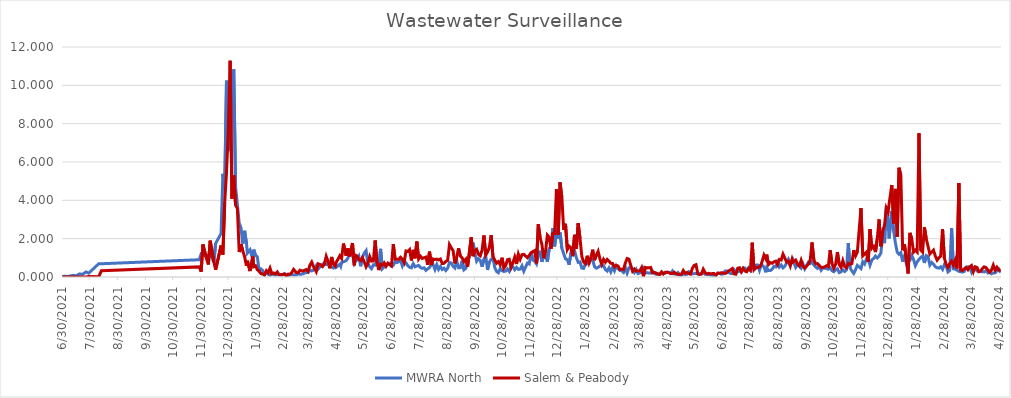
| Category | MWRA North | Salem & Peabody |
|---|---|---|
| 6/30/21 | 0.023 | 0 |
| 7/2/21 | 0.04 | 0 |
| 7/6/21 | 0.027 | 0 |
| 7/8/21 | 0.05 | 0 |
| 7/12/21 | 0.087 | 0 |
| 7/15/21 | 0.059 | 0 |
| 7/19/21 | 0.163 | 0 |
| 7/22/21 | 0.136 | 0 |
| 7/26/21 | 0.263 | 0 |
| 7/29/21 | 0.2 | 0.032 |
| 8/9/21 | 0.691 | 0.007 |
| 8/12/21 | 0.691 | 0.329 |
| 11/28/21 | 0.901 | 0.528 |
| 11/30/21 | 1.204 | 0.275 |
| 12/2/21 | 1.163 | 1.699 |
| 12/6/21 | 1.093 | 0.943 |
| 12/8/21 | 1.152 | 0.651 |
| 12/10/21 | 1.257 | 1.895 |
| 12/14/21 | 0.765 | 0.806 |
| 12/16/21 | 1.751 | 0.377 |
| 12/22/21 | 2.277 | 1.638 |
| 12/24/21 | 5.383 | 1.167 |
| 12/26/21 | 4.572 | 3.882 |
| 12/28/21 | 10.243 | 5.443 |
| 12/30/21 | 8.435 | 7.638 |
| 1/1/22 | 6.568 | 11.282 |
| 1/3/22 | 10.196 | 4.086 |
| 1/5/22 | 10.833 | 5.297 |
| 1/7/22 | 4.705 | 3.753 |
| 1/9/22 | 3.807 | 3.57 |
| 1/11/22 | 2.813 | 1.302 |
| 1/13/22 | 2.562 | 1.704 |
| 1/15/22 | 1.737 | 1.36 |
| 1/17/22 | 2.411 | 1.052 |
| 1/19/22 | 1.766 | 0.581 |
| 1/20/22 | 1.245 | 0.849 |
| 1/23/22 | 1.42 | 0.312 |
| 1/26/22 | 0.904 | 1.062 |
| 1/27/22 | 1.426 | 0.538 |
| 1/29/22 | 1.132 | 0.587 |
| 1/31/22 | 1.053 | 0.378 |
| 2/2/22 | 0.334 | 0.319 |
| 2/4/22 | 0.422 | 0.179 |
| 2/6/22 | 0.336 | 0.151 |
| 2/8/22 | 0.11 | 0.116 |
| 2/10/22 | 0.233 | 0.327 |
| 2/12/22 | 0.14 | 0.223 |
| 2/14/22 | 0.094 | 0.461 |
| 2/16/22 | 0.206 | 0.164 |
| 2/18/22 | 0.124 | 0.209 |
| 2/20/22 | 0.101 | 0.169 |
| 2/22/22 | 0.124 | 0.267 |
| 2/24/22 | 0.138 | 0.116 |
| 2/26/22 | 0.113 | 0.121 |
| 2/28/22 | 0.102 | 0.138 |
| 3/2/22 | 0.17 | 0.16 |
| 3/4/22 | 0.121 | 0.039 |
| 3/6/22 | 0.08 | 0.151 |
| 3/8/22 | 0.105 | 0.146 |
| 3/10/22 | 0.139 | 0.227 |
| 3/12/22 | 0.105 | 0.397 |
| 3/15/22 | 0.115 | 0.231 |
| 3/17/22 | 0.165 | 0.219 |
| 3/19/22 | 0.138 | 0.356 |
| 3/22/22 | 0.161 | 0.308 |
| 3/26/22 | 0.236 | 0.388 |
| 3/28/22 | 0.23 | 0.293 |
| 3/30/22 | 0.371 | 0.617 |
| 4/1/22 | 0.316 | 0.779 |
| 4/3/22 | 0.358 | 0.54 |
| 4/6/22 | 0.589 | 0.279 |
| 4/8/22 | 0.411 | 0.688 |
| 4/11/22 | 0.565 | 0.635 |
| 4/13/22 | 0.647 | 0.546 |
| 4/15/22 | 0.752 | 0.666 |
| 4/17/22 | 0.654 | 1.077 |
| 4/19/22 | 0.641 | 0.82 |
| 4/21/22 | 0.571 | 0.454 |
| 4/23/22 | 0.524 | 1.046 |
| 4/25/22 | 0.471 | 0.662 |
| 4/27/22 | 0.623 | 0.575 |
| 4/28/22 | 0.505 | 0.756 |
| 5/2/22 | 0.662 | 1.104 |
| 5/3/22 | 0.561 | 1.022 |
| 5/4/22 | 0.751 | 0.963 |
| 5/6/22 | 0.789 | 1.744 |
| 5/9/22 | 0.853 | 1.115 |
| 5/11/22 | 0.995 | 1.498 |
| 5/13/22 | 1.285 | 1.074 |
| 5/16/22 | 1.143 | 1.773 |
| 5/18/22 | 0.696 | 0.611 |
| 5/19/22 | 0.784 | 1.144 |
| 5/21/22 | 0.906 | 1.1 |
| 5/23/22 | 1.077 | 0.91 |
| 5/25/22 | 0.561 | 0.853 |
| 5/27/22 | 1.043 | 1.006 |
| 5/29/22 | 1.246 | 0.785 |
| 5/31/22 | 1.375 | 0.53 |
| 6/2/22 | 0.696 | 0.713 |
| 6/4/22 | 0.532 | 1.066 |
| 6/6/22 | 0.435 | 0.828 |
| 6/8/22 | 0.636 | 0.839 |
| 6/10/22 | 0.619 | 1.907 |
| 6/12/22 | 0.932 | 0.783 |
| 6/14/22 | 0.461 | 0.361 |
| 6/16/22 | 1.468 | 0.667 |
| 6/18/22 | 0.433 | 0.622 |
| 6/20/22 | 0.532 | 0.737 |
| 6/22/22 | 0.611 | 0.559 |
| 6/24/22 | 0.648 | 0.724 |
| 6/26/22 | 0.688 | 0.646 |
| 6/28/22 | 0.562 | 0.577 |
| 6/30/22 | 0.607 | 1.712 |
| 7/2/22 | 0.8 | 0.932 |
| 7/4/22 | 0.751 | 0.927 |
| 7/6/22 | 0.8 | 0.928 |
| 7/8/22 | 0.861 | 1.027 |
| 7/10/22 | 0.579 | 0.928 |
| 7/12/22 | 0.808 | 0.757 |
| 7/14/22 | 0.742 | 1.358 |
| 7/16/22 | 0.592 | 1.335 |
| 7/18/22 | 0.509 | 1.432 |
| 7/20/22 | 0.482 | 0.863 |
| 7/22/22 | 0.695 | 1.416 |
| 7/24/22 | 0.53 | 0.974 |
| 7/26/22 | 0.576 | 1.848 |
| 7/28/22 | 0.605 | 0.943 |
| 7/30/22 | 0.492 | 1.081 |
| 8/1/22 | 0.453 | 0.969 |
| 8/3/22 | 0.481 | 1.003 |
| 8/5/22 | 0.349 | 1.038 |
| 8/7/22 | 0.424 | 0.634 |
| 8/9/22 | 0.492 | 1.322 |
| 8/11/22 | 0.664 | 0.624 |
| 8/13/22 | 0.648 | 0.94 |
| 8/15/22 | 0.393 | 0.912 |
| 8/17/22 | 0.648 | 0.935 |
| 8/19/22 | 0.397 | 0.892 |
| 8/21/22 | 0.546 | 0.94 |
| 8/23/22 | 0.392 | 0.701 |
| 8/25/22 | 0.461 | 0.713 |
| 8/27/22 | 0.339 | 0.812 |
| 8/29/22 | 0.46 | 0.873 |
| 8/31/22 | 0.758 | 1.69 |
| 9/2/22 | 0.728 | 1.519 |
| 9/4/22 | 0.557 | 1.377 |
| 9/6/22 | 0.473 | 0.706 |
| 9/8/22 | 0.826 | 1.041 |
| 9/10/22 | 0.485 | 1.497 |
| 9/12/22 | 0.489 | 1.095 |
| 9/14/22 | 0.851 | 0.994 |
| 9/16/22 | 0.375 | 0.804 |
| 9/18/22 | 0.45 | 0.926 |
| 9/20/22 | 0.767 | 0.537 |
| 9/24/22 | 1.357 | 2.067 |
| 9/26/22 | 1.79 | 1.083 |
| 9/28/22 | 1.272 | 1.382 |
| 9/30/22 | 0.825 | 1.447 |
| 10/2/22 | 0.959 | 1.18 |
| 10/4/22 | 0.862 | 1.109 |
| 10/6/22 | 0.536 | 1.407 |
| 10/8/22 | 0.925 | 2.166 |
| 10/10/22 | 1.104 | 1.147 |
| 10/12/22 | 0.369 | 1.304 |
| 10/14/22 | 0.781 | 1.544 |
| 10/16/22 | 0.928 | 2.189 |
| 10/18/22 | 0.972 | 1.054 |
| 10/20/22 | 0.493 | 0.883 |
| 10/22/22 | 0.287 | 0.721 |
| 10/24/22 | 0.224 | 0.803 |
| 10/26/22 | 0.45 | 0.639 |
| 10/28/22 | 0.325 | 1.007 |
| 10/30/22 | 0.287 | 0.464 |
| 11/1/22 | 0.307 | 0.6 |
| 11/3/22 | 0.421 | 0.904 |
| 11/5/22 | 0.293 | 0.926 |
| 11/7/22 | 0.54 | 0.505 |
| 11/9/22 | 0.525 | 0.742 |
| 11/11/22 | 0.38 | 1.039 |
| 11/13/22 | 0.5 | 0.678 |
| 11/15/22 | 0.397 | 1.19 |
| 11/17/22 | 0.414 | 0.927 |
| 11/19/22 | 0.583 | 1.166 |
| 11/21/22 | 0.304 | 1.181 |
| 11/25/22 | 0.727 | 1.009 |
| 11/27/22 | 0.682 | 1.128 |
| 11/29/22 | 1.292 | 1.263 |
| 12/1/22 | 0.879 | 1.332 |
| 12/3/22 | 0.834 | 1.378 |
| 12/5/22 | 0.685 | 0.71 |
| 12/7/22 | 1.094 | 2.747 |
| 12/9/22 | 1.37 | 2.05 |
| 12/11/22 | 0.792 | 1.692 |
| 12/13/22 | 1.108 | 0.983 |
| 12/15/22 | 1.123 | 1.348 |
| 12/17/22 | 0.789 | 2.185 |
| 12/19/22 | 1.476 | 2.073 |
| 12/21/22 | 1.593 | 1.47 |
| 12/23/22 | 2.551 | 2.278 |
| 12/25/22 | 1.597 | 2.275 |
| 12/27/22 | 2.423 | 4.578 |
| 12/29/22 | 2.003 | 2.196 |
| 12/31/22 | 2.33 | 4.939 |
| 1/2/23 | 1.499 | 4.153 |
| 1/4/23 | 1.214 | 2.457 |
| 1/6/23 | 0.947 | 2.778 |
| 1/8/23 | 0.904 | 1.437 |
| 1/10/23 | 0.64 | 1.61 |
| 1/12/23 | 1.241 | 1.532 |
| 1/14/23 | 1.154 | 1.092 |
| 1/16/23 | 1.37 | 2.202 |
| 1/18/23 | 1.009 | 1.465 |
| 1/20/23 | 0.763 | 2.809 |
| 1/22/23 | 0.787 | 2.022 |
| 1/24/23 | 0.465 | 1.08 |
| 1/26/23 | 0.448 | 0.782 |
| 1/28/23 | 0.685 | 0.698 |
| 1/30/23 | 0.689 | 1.11 |
| 2/1/23 | 0.706 | 0.743 |
| 2/3/23 | 0.907 | 1.008 |
| 2/5/23 | 0.913 | 1.425 |
| 2/7/23 | 0.539 | 0.879 |
| 2/9/23 | 0.461 | 1.141 |
| 2/11/23 | 0.498 | 1.339 |
| 2/13/23 | 0.579 | 0.95 |
| 2/15/23 | 0.588 | 0.66 |
| 2/17/23 | 0.592 | 0.919 |
| 2/19/23 | 0.391 | 0.773 |
| 2/21/23 | 0.312 | 0.917 |
| 2/23/23 | 0.472 | 0.828 |
| 2/25/23 | 0.266 | 0.714 |
| 2/27/23 | 0.513 | 0.704 |
| 3/1/23 | 0.321 | 0.528 |
| 3/3/23 | 0.58 | 0.61 |
| 3/5/23 | 0.437 | 0.573 |
| 3/7/23 | 0.341 | 0.388 |
| 3/9/23 | 0.33 | 0.412 |
| 3/11/23 | 0.24 | 0.383 |
| 3/13/23 | 0.499 | 0.725 |
| 3/15/23 | 0.197 | 0.964 |
| 3/17/23 | 0.479 | 0.931 |
| 3/19/23 | 0.51 | 0.612 |
| 3/21/23 | 0.399 | 0.301 |
| 3/23/23 | 0.237 | 0.415 |
| 3/25/23 | 0.395 | 0.308 |
| 3/27/23 | 0.178 | 0.314 |
| 3/29/23 | 0.217 | 0.326 |
| 3/31/23 | 0.243 | 0.491 |
| 4/2/23 | 0.43 | 0.024 |
| 4/4/23 | 0.215 | 0.5 |
| 4/6/23 | 0.229 | 0.475 |
| 4/8/23 | 0.202 | 0.481 |
| 4/10/23 | 0.209 | 0.497 |
| 4/12/23 | 0.305 | 0.215 |
| 4/14/23 | 0.182 | 0.243 |
| 4/16/23 | 0.142 | 0.21 |
| 4/18/23 | 0.177 | 0.143 |
| 4/20/23 | 0.158 | 0.13 |
| 4/22/23 | 0.195 | 0.266 |
| 4/24/23 | 0.209 | 0.158 |
| 4/26/23 | 0.195 | 0.249 |
| 4/28/23 | 0.245 | 0.25 |
| 4/30/23 | 0.245 | 0.228 |
| 5/2/23 | 0.18 | 0.185 |
| 5/4/23 | 0.314 | 0.177 |
| 5/6/23 | 0.157 | 0.247 |
| 5/8/23 | 0.162 | 0.165 |
| 5/10/23 | 0.234 | 0.135 |
| 5/12/23 | 0.1 | 0.143 |
| 5/14/23 | 0.1 | 0.144 |
| 5/16/23 | 0.156 | 0.338 |
| 5/18/23 | 0.134 | 0.195 |
| 5/20/23 | 0.141 | 0.237 |
| 5/22/23 | 0.279 | 0.178 |
| 5/24/23 | 0.223 | 0.15 |
| 5/26/23 | 0.176 | 0.458 |
| 5/28/23 | 0.176 | 0.602 |
| 5/30/23 | 0.183 | 0.643 |
| 6/1/23 | 0.153 | 0.167 |
| 6/3/23 | 0.172 | 0.13 |
| 6/5/23 | 0.198 | 0.156 |
| 6/7/23 | 0.243 | 0.409 |
| 6/9/23 | 0.143 | 0.231 |
| 6/11/23 | 0.143 | 0.16 |
| 6/13/23 | 0.122 | 0.195 |
| 6/15/23 | 0.11 | 0.156 |
| 6/17/23 | 0.095 | 0.181 |
| 6/19/23 | 0.054 | 0.18 |
| 6/21/23 | 0.122 | 0.089 |
| 6/23/23 | 0.195 | 0.208 |
| 6/25/23 | 0.195 | 0.187 |
| 6/27/23 | 0.141 | 0.225 |
| 6/29/23 | 0.16 | 0.211 |
| 7/1/23 | 0.31 | 0.183 |
| 7/3/23 | 0.312 | 0.225 |
| 7/5/23 | 0.244 | 0.321 |
| 7/7/23 | 0.184 | 0.366 |
| 7/9/23 | 0.184 | 0.437 |
| 7/11/23 | 0.38 | 0.163 |
| 7/13/23 | 0.255 | 0.147 |
| 7/15/23 | 0.268 | 0.451 |
| 7/17/23 | 0.315 | 0.484 |
| 7/19/23 | 0.252 | 0.278 |
| 7/21/23 | 0.47 | 0.451 |
| 7/23/23 | 0.47 | 0.309 |
| 7/25/23 | 0.325 | 0.277 |
| 7/27/23 | 0.478 | 0.439 |
| 7/29/23 | 0.339 | 0.359 |
| 7/31/23 | 0.538 | 1.791 |
| 8/2/23 | 0.514 | 0.375 |
| 8/4/23 | 0.625 | 0.476 |
| 8/6/23 | 0.625 | 0.501 |
| 8/8/23 | 0.347 | 0.517 |
| 8/10/23 | 0.645 | 0.663 |
| 8/13/23 | 0.533 | 1.145 |
| 8/15/23 | 0.245 | 0.951 |
| 8/16/23 | 0.489 | 1.169 |
| 8/18/23 | 0.336 | 0.656 |
| 8/20/23 | 0.336 | 0.753 |
| 8/22/23 | 0.407 | 0.717 |
| 8/24/23 | 0.558 | 0.79 |
| 8/26/23 | 0.526 | 0.826 |
| 8/28/23 | 0.757 | 0.651 |
| 8/30/23 | 0.52 | 0.914 |
| 9/1/23 | 0.628 | 0.889 |
| 9/3/23 | 0.475 | 1.194 |
| 9/5/23 | 0.563 | 0.989 |
| 9/7/23 | 0.731 | 0.782 |
| 9/9/23 | 0.922 | 0.819 |
| 9/11/23 | 0.696 | 0.573 |
| 9/13/23 | 0.75 | 0.928 |
| 9/14/23 | 0.882 | 0.78 |
| 9/17/23 | 0.503 | 0.884 |
| 9/19/23 | 0.645 | 0.68 |
| 9/21/23 | 0.575 | 0.58 |
| 9/23/23 | 0.465 | 0.87 |
| 9/25/23 | 0.673 | 0.57 |
| 9/27/23 | 0.429 | 0.47 |
| 10/1/23 | 0.773 | 0.67 |
| 10/3/23 | 0.702 | 0.88 |
| 10/5/23 | 0.78 | 1.8 |
| 10/7/23 | 0.63 | 0.9 |
| 10/9/23 | 0.524 | 0.69 |
| 10/11/23 | 0.448 | 0.7 |
| 10/13/23 | 0.571 | 0.6 |
| 10/15/23 | 0.35 | 0.5 |
| 10/17/23 | 0.468 | 0.5 |
| 10/19/23 | 0.46 | 0.53 |
| 10/21/23 | 0.442 | 0.59 |
| 10/23/23 | 0.407 | 0.55 |
| 10/25/23 | 0.475 | 1.4 |
| 10/27/23 | 0.329 | 0.7 |
| 10/29/23 | 0.277 | 0.46 |
| 10/31/23 | 0.366 | 0.66 |
| 11/2/23 | 0.431 | 1.3 |
| 11/4/23 | 0.23 | 0.66 |
| 11/6/23 | 0.268 | 0.5 |
| 11/8/23 | 0.372 | 0.85 |
| 11/10/23 | 0.287 | 0.54 |
| 11/12/23 | 0.373 | 0.48 |
| 11/14/23 | 1.767 | 0.71 |
| 11/16/23 | 0.468 | 0.67 |
| 11/18/23 | 0.315 | 0.7 |
| 11/20/23 | 0.188 | 1.4 |
| 11/22/23 | 0.38 | 1.1 |
| 11/24/23 | 0.608 | 1.3 |
| 11/28/23 | 0.44 | 3.6 |
| 11/30/23 | 0.791 | 1.1 |
| 12/2/23 | 0.677 | 1.2 |
| 12/4/23 | 0.943 | 1.3 |
| 12/6/23 | 0.966 | 0.79 |
| 12/8/23 | 0.618 | 2.5 |
| 12/10/23 | 0.892 | 1.5 |
| 12/12/23 | 0.964 | 1.6 |
| 12/14/23 | 1.091 | 1.3 |
| 12/16/23 | 0.99 | 2 |
| 12/18/23 | 1.089 | 3 |
| 12/20/23 | 1.252 | 1.6 |
| 12/22/23 | 2.214 | 2.4 |
| 12/24/23 | 1.769 | 2.7 |
| 12/26/23 | 3.689 | 3.6 |
| 12/28/23 | 2.81 | 3.4 |
| 12/29/23 | 2.013 | 3.8 |
| 1/1/24 | 3.443 | 4.8 |
| 1/3/24 | 2.411 | 2.8 |
| 1/5/24 | 1.78 | 4.6 |
| 1/7/24 | 1.295 | 2.1 |
| 1/9/24 | 1.184 | 5.7 |
| 1/11/24 | 1.27 | 5.3 |
| 1/13/24 | 0.802 | 1.4 |
| 1/15/24 | 1.091 | 1.7 |
| 1/17/24 | 0.716 | 0.94 |
| 1/19/24 | 0.852 | 0.18 |
| 1/21/24 | 0.866 | 2.3 |
| 1/23/24 | 1.127 | 2 |
| 1/25/24 | 0.911 | 1.3 |
| 1/27/24 | 0.591 | 1.4 |
| 1/29/24 | 0.786 | 1.3 |
| 1/31/24 | 0.915 | 7.5 |
| 2/2/24 | 1.022 | 1.4 |
| 2/4/24 | 1.092 | 1.3 |
| 2/6/24 | 0.732 | 2.6 |
| 2/8/24 | 1.114 | 2 |
| 2/10/24 | 1.061 | 1.6 |
| 2/12/24 | 0.622 | 1.2 |
| 2/14/24 | 0.758 | 1.3 |
| 2/16/24 | 0.672 | 1.4 |
| 2/18/24 | 0.536 | 1.1 |
| 2/20/24 | 0.483 | 0.88 |
| 2/22/24 | 0.462 | 1 |
| 2/24/24 | 0.532 | 1.1 |
| 2/26/24 | 0.398 | 2.5 |
| 2/28/24 | 0.647 | 0.99 |
| 3/1/24 | 0.579 | 0.66 |
| 3/3/24 | 0.265 | 0.5 |
| 3/5/24 | 0.341 | 0.7 |
| 3/7/24 | 2.546 | 0.83 |
| 3/9/24 | 0.429 | 0.62 |
| 3/11/24 | 0.407 | 0.87 |
| 3/13/24 | 0.358 | 0.44 |
| 3/15/24 | 0.293 | 4.9 |
| 3/17/24 | 0.275 | 0.36 |
| 3/19/24 | 0.256 | 0.34 |
| 3/21/24 | 0.289 | 0.43 |
| 3/23/24 | 0.517 | 0.49 |
| 3/25/24 | 0.532 | 0.38 |
| 3/27/24 | 0.511 | 0.53 |
| 3/29/24 | 0.256 | 0.6 |
| 3/31/24 | 0.474 | 0.28 |
| 4/2/24 | 0.507 | 0.53 |
| 4/4/24 | 0.315 | 0.5 |
| 4/6/24 | 0.284 | 0.28 |
| 4/8/24 | 0.287 | 0.31 |
| 4/10/24 | 0.272 | 0.44 |
| 4/12/24 | 0.267 | 0.53 |
| 4/14/24 | 0.327 | 0.49 |
| 4/16/24 | 0.217 | 0.36 |
| 4/18/24 | 0.3 | 0.25 |
| 4/20/24 | 0.171 | 0.36 |
| 4/22/24 | 0.212 | 0.62 |
| 4/24/24 | 0.216 | 0.36 |
| 4/26/24 | 0.318 | 0.51 |
| 4/28/24 | 0.415 | 0.36 |
| 4/30/24 | 0.23 | 0.35 |